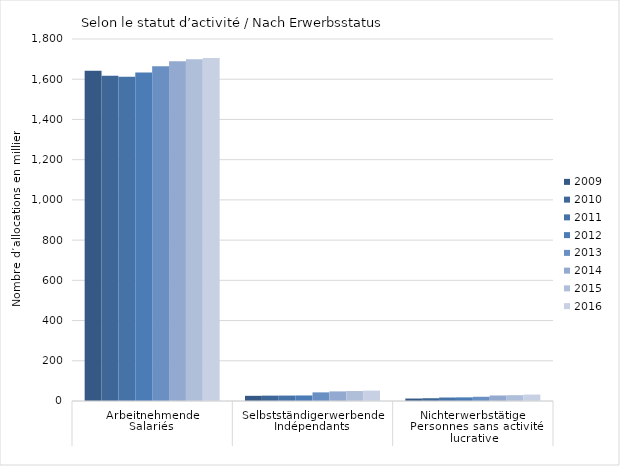
| Category | 2009 | 2010 | 2011 | 2012 | 2013 | 2014 | 2015 | 2016 |
|---|---|---|---|---|---|---|---|---|
| 0 | 1642.677 | 1617.291 | 1612.528 | 1633.667 | 1664.882 | 1689.614 | 1698.984 | 1705.381 |
| 1 | 25.744 | 26.723 | 27.015 | 27.548 | 42.954 | 47.728 | 49.54 | 51.552 |
| 2 | 12.221 | 13.858 | 17.329 | 18.051 | 21.03 | 27.428 | 29 | 32.018 |